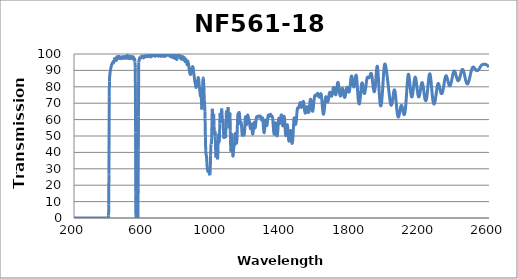
| Category | Transmission (%) |
|---|---|
| 2600.0 | 92.114 |
| 2599.0 | 92.203 |
| 2598.0 | 92.326 |
| 2597.0 | 92.426 |
| 2596.0 | 92.522 |
| 2595.0 | 92.617 |
| 2594.0 | 92.727 |
| 2593.0 | 92.835 |
| 2592.0 | 92.89 |
| 2591.0 | 92.995 |
| 2590.0 | 93.116 |
| 2589.0 | 93.186 |
| 2588.0 | 93.271 |
| 2587.0 | 93.36 |
| 2586.0 | 93.403 |
| 2585.0 | 93.418 |
| 2584.0 | 93.468 |
| 2583.0 | 93.502 |
| 2582.0 | 93.578 |
| 2581.0 | 93.599 |
| 2580.0 | 93.636 |
| 2579.0 | 93.667 |
| 2578.0 | 93.708 |
| 2577.0 | 93.737 |
| 2576.0 | 93.742 |
| 2575.0 | 93.785 |
| 2574.0 | 93.809 |
| 2573.0 | 93.809 |
| 2572.0 | 93.773 |
| 2571.0 | 93.778 |
| 2570.0 | 93.733 |
| 2569.0 | 93.734 |
| 2568.0 | 93.763 |
| 2567.0 | 93.677 |
| 2566.0 | 93.69 |
| 2565.0 | 93.678 |
| 2564.0 | 93.588 |
| 2563.0 | 93.552 |
| 2562.0 | 93.538 |
| 2561.0 | 93.467 |
| 2560.0 | 93.405 |
| 2559.0 | 93.328 |
| 2558.0 | 93.276 |
| 2557.0 | 93.203 |
| 2556.0 | 93.128 |
| 2555.0 | 92.994 |
| 2554.0 | 92.855 |
| 2553.0 | 92.7 |
| 2552.0 | 92.556 |
| 2551.0 | 92.392 |
| 2550.0 | 92.189 |
| 2549.0 | 92.025 |
| 2548.0 | 91.843 |
| 2547.0 | 91.636 |
| 2546.0 | 91.442 |
| 2545.0 | 91.264 |
| 2544.0 | 91.101 |
| 2543.0 | 90.962 |
| 2542.0 | 90.813 |
| 2541.0 | 90.681 |
| 2540.0 | 90.547 |
| 2539.0 | 90.412 |
| 2538.0 | 90.283 |
| 2537.0 | 90.152 |
| 2536.0 | 90.088 |
| 2535.0 | 89.992 |
| 2534.0 | 89.943 |
| 2533.0 | 89.9 |
| 2532.0 | 89.881 |
| 2531.0 | 89.858 |
| 2530.0 | 89.851 |
| 2529.0 | 89.848 |
| 2528.0 | 89.924 |
| 2527.0 | 89.988 |
| 2526.0 | 90.039 |
| 2525.0 | 90.13 |
| 2524.0 | 90.246 |
| 2523.0 | 90.4 |
| 2522.0 | 90.508 |
| 2521.0 | 90.605 |
| 2520.0 | 90.794 |
| 2519.0 | 90.948 |
| 2518.0 | 91.08 |
| 2517.0 | 91.257 |
| 2516.0 | 91.443 |
| 2515.0 | 91.589 |
| 2514.0 | 91.717 |
| 2513.0 | 91.81 |
| 2512.0 | 91.892 |
| 2511.0 | 91.968 |
| 2510.0 | 92.042 |
| 2509.0 | 92.045 |
| 2508.0 | 92.023 |
| 2507.0 | 91.958 |
| 2506.0 | 91.87 |
| 2505.0 | 91.759 |
| 2504.0 | 91.586 |
| 2503.0 | 91.426 |
| 2502.0 | 91.185 |
| 2501.0 | 90.9 |
| 2500.0 | 90.588 |
| 2499.0 | 90.236 |
| 2498.0 | 89.873 |
| 2497.0 | 89.489 |
| 2496.0 | 89.097 |
| 2495.0 | 88.667 |
| 2494.0 | 88.212 |
| 2493.0 | 87.712 |
| 2492.0 | 87.227 |
| 2491.0 | 86.74 |
| 2490.0 | 86.259 |
| 2489.0 | 85.813 |
| 2488.0 | 85.375 |
| 2487.0 | 84.913 |
| 2486.0 | 84.462 |
| 2485.0 | 84.022 |
| 2484.0 | 83.63 |
| 2483.0 | 83.297 |
| 2482.0 | 82.96 |
| 2481.0 | 82.649 |
| 2480.0 | 82.403 |
| 2479.0 | 82.187 |
| 2478.0 | 81.997 |
| 2477.0 | 81.872 |
| 2476.0 | 81.797 |
| 2475.0 | 81.761 |
| 2474.0 | 81.775 |
| 2473.0 | 81.842 |
| 2472.0 | 81.978 |
| 2471.0 | 82.159 |
| 2470.0 | 82.362 |
| 2469.0 | 82.623 |
| 2468.0 | 82.94 |
| 2467.0 | 83.262 |
| 2466.0 | 83.625 |
| 2465.0 | 84.072 |
| 2464.0 | 84.544 |
| 2463.0 | 85.013 |
| 2462.0 | 85.505 |
| 2461.0 | 85.97 |
| 2460.0 | 86.451 |
| 2459.0 | 86.948 |
| 2458.0 | 87.448 |
| 2457.0 | 87.901 |
| 2456.0 | 88.35 |
| 2455.0 | 88.74 |
| 2454.0 | 89.112 |
| 2453.0 | 89.479 |
| 2452.0 | 89.808 |
| 2451.0 | 90.079 |
| 2450.0 | 90.292 |
| 2449.0 | 90.456 |
| 2448.0 | 90.563 |
| 2447.0 | 90.604 |
| 2446.0 | 90.598 |
| 2445.0 | 90.521 |
| 2444.0 | 90.38 |
| 2443.0 | 90.214 |
| 2442.0 | 89.996 |
| 2441.0 | 89.702 |
| 2440.0 | 89.36 |
| 2439.0 | 88.974 |
| 2438.0 | 88.571 |
| 2437.0 | 88.156 |
| 2436.0 | 87.726 |
| 2435.0 | 87.284 |
| 2434.0 | 86.839 |
| 2433.0 | 86.407 |
| 2432.0 | 85.978 |
| 2431.0 | 85.581 |
| 2430.0 | 85.23 |
| 2429.0 | 84.921 |
| 2428.0 | 84.591 |
| 2427.0 | 84.298 |
| 2426.0 | 84.102 |
| 2425.0 | 83.939 |
| 2424.0 | 83.814 |
| 2423.0 | 83.741 |
| 2422.0 | 83.716 |
| 2421.0 | 83.725 |
| 2420.0 | 83.78 |
| 2419.0 | 83.899 |
| 2418.0 | 84.087 |
| 2417.0 | 84.31 |
| 2416.0 | 84.596 |
| 2415.0 | 84.92 |
| 2414.0 | 85.231 |
| 2413.0 | 85.578 |
| 2412.0 | 85.931 |
| 2411.0 | 86.288 |
| 2410.0 | 86.691 |
| 2409.0 | 87.113 |
| 2408.0 | 87.514 |
| 2407.0 | 87.905 |
| 2406.0 | 88.256 |
| 2405.0 | 88.558 |
| 2404.0 | 88.846 |
| 2403.0 | 89.115 |
| 2402.0 | 89.346 |
| 2401.0 | 89.502 |
| 2400.0 | 89.584 |
| 2399.0 | 89.629 |
| 2398.0 | 89.604 |
| 2397.0 | 89.496 |
| 2396.0 | 89.33 |
| 2395.0 | 89.074 |
| 2394.0 | 88.779 |
| 2393.0 | 88.453 |
| 2392.0 | 88.076 |
| 2391.0 | 87.604 |
| 2390.0 | 87.081 |
| 2389.0 | 86.55 |
| 2388.0 | 85.991 |
| 2387.0 | 85.445 |
| 2386.0 | 84.9 |
| 2385.0 | 84.362 |
| 2384.0 | 83.847 |
| 2383.0 | 83.309 |
| 2382.0 | 82.804 |
| 2381.0 | 82.363 |
| 2380.0 | 81.969 |
| 2379.0 | 81.614 |
| 2378.0 | 81.318 |
| 2377.0 | 81.067 |
| 2376.0 | 80.852 |
| 2375.0 | 80.692 |
| 2374.0 | 80.602 |
| 2373.0 | 80.591 |
| 2372.0 | 80.656 |
| 2371.0 | 80.78 |
| 2370.0 | 80.923 |
| 2369.0 | 81.111 |
| 2368.0 | 81.364 |
| 2367.0 | 81.653 |
| 2366.0 | 82.005 |
| 2365.0 | 82.397 |
| 2364.0 | 82.793 |
| 2363.0 | 83.24 |
| 2362.0 | 83.716 |
| 2361.0 | 84.165 |
| 2360.0 | 84.607 |
| 2359.0 | 85.027 |
| 2358.0 | 85.408 |
| 2357.0 | 85.787 |
| 2356.0 | 86.123 |
| 2355.0 | 86.419 |
| 2354.0 | 86.63 |
| 2353.0 | 86.754 |
| 2352.0 | 86.8 |
| 2351.0 | 86.745 |
| 2350.0 | 86.572 |
| 2349.0 | 86.339 |
| 2348.0 | 86.043 |
| 2347.0 | 85.715 |
| 2346.0 | 85.34 |
| 2345.0 | 84.838 |
| 2344.0 | 84.289 |
| 2343.0 | 83.681 |
| 2342.0 | 83.014 |
| 2341.0 | 82.342 |
| 2340.0 | 81.665 |
| 2339.0 | 81.003 |
| 2338.0 | 80.357 |
| 2337.0 | 79.719 |
| 2336.0 | 79.093 |
| 2335.0 | 78.511 |
| 2334.0 | 77.98 |
| 2333.0 | 77.496 |
| 2332.0 | 77.067 |
| 2331.0 | 76.692 |
| 2330.0 | 76.376 |
| 2329.0 | 76.123 |
| 2328.0 | 75.954 |
| 2327.0 | 75.87 |
| 2326.0 | 75.825 |
| 2325.0 | 75.848 |
| 2324.0 | 75.953 |
| 2323.0 | 76.137 |
| 2322.0 | 76.36 |
| 2321.0 | 76.633 |
| 2320.0 | 76.984 |
| 2319.0 | 77.402 |
| 2318.0 | 77.836 |
| 2317.0 | 78.335 |
| 2316.0 | 78.832 |
| 2315.0 | 79.321 |
| 2314.0 | 79.816 |
| 2313.0 | 80.295 |
| 2312.0 | 80.716 |
| 2311.0 | 81.096 |
| 2310.0 | 81.426 |
| 2309.0 | 81.725 |
| 2308.0 | 81.911 |
| 2307.0 | 82.015 |
| 2306.0 | 82.014 |
| 2305.0 | 81.872 |
| 2304.0 | 81.654 |
| 2303.0 | 81.322 |
| 2302.0 | 80.933 |
| 2301.0 | 80.404 |
| 2300.0 | 79.864 |
| 2299.0 | 79.216 |
| 2298.0 | 78.52 |
| 2297.0 | 77.739 |
| 2296.0 | 76.943 |
| 2295.0 | 76.161 |
| 2294.0 | 75.367 |
| 2293.0 | 74.579 |
| 2292.0 | 73.86 |
| 2291.0 | 73.127 |
| 2290.0 | 72.459 |
| 2289.0 | 71.822 |
| 2288.0 | 71.205 |
| 2287.0 | 70.674 |
| 2286.0 | 70.237 |
| 2285.0 | 69.912 |
| 2284.0 | 69.679 |
| 2283.0 | 69.542 |
| 2282.0 | 69.471 |
| 2281.0 | 69.516 |
| 2280.0 | 69.683 |
| 2279.0 | 69.974 |
| 2278.0 | 70.361 |
| 2277.0 | 70.873 |
| 2276.0 | 71.5 |
| 2275.0 | 72.21 |
| 2274.0 | 73.044 |
| 2273.0 | 74.012 |
| 2272.0 | 74.997 |
| 2271.0 | 76.1 |
| 2270.0 | 77.226 |
| 2269.0 | 78.386 |
| 2268.0 | 79.56 |
| 2267.0 | 80.751 |
| 2266.0 | 81.933 |
| 2265.0 | 83.088 |
| 2264.0 | 84.159 |
| 2263.0 | 85.154 |
| 2262.0 | 86.013 |
| 2261.0 | 86.715 |
| 2260.0 | 87.261 |
| 2259.0 | 87.683 |
| 2258.0 | 87.881 |
| 2257.0 | 87.915 |
| 2256.0 | 87.762 |
| 2255.0 | 87.412 |
| 2254.0 | 86.896 |
| 2253.0 | 86.266 |
| 2252.0 | 85.499 |
| 2251.0 | 84.605 |
| 2250.0 | 83.656 |
| 2249.0 | 82.619 |
| 2248.0 | 81.547 |
| 2247.0 | 80.44 |
| 2246.0 | 79.296 |
| 2245.0 | 78.209 |
| 2244.0 | 77.187 |
| 2243.0 | 76.194 |
| 2242.0 | 75.237 |
| 2241.0 | 74.398 |
| 2240.0 | 73.686 |
| 2239.0 | 73.004 |
| 2238.0 | 72.417 |
| 2237.0 | 71.992 |
| 2236.0 | 71.707 |
| 2235.0 | 71.549 |
| 2234.0 | 71.463 |
| 2233.0 | 71.571 |
| 2232.0 | 71.741 |
| 2231.0 | 72.056 |
| 2230.0 | 72.432 |
| 2229.0 | 72.905 |
| 2228.0 | 73.527 |
| 2227.0 | 74.196 |
| 2226.0 | 74.937 |
| 2225.0 | 75.733 |
| 2224.0 | 76.554 |
| 2223.0 | 77.41 |
| 2222.0 | 78.229 |
| 2221.0 | 79.041 |
| 2220.0 | 79.817 |
| 2219.0 | 80.507 |
| 2218.0 | 81.139 |
| 2217.0 | 81.705 |
| 2216.0 | 82.09 |
| 2215.0 | 82.362 |
| 2214.0 | 82.549 |
| 2213.0 | 82.603 |
| 2212.0 | 82.515 |
| 2211.0 | 82.335 |
| 2210.0 | 82.031 |
| 2209.0 | 81.583 |
| 2208.0 | 81.055 |
| 2207.0 | 80.527 |
| 2206.0 | 79.835 |
| 2205.0 | 79.146 |
| 2204.0 | 78.444 |
| 2203.0 | 77.75 |
| 2202.0 | 77.098 |
| 2201.0 | 76.398 |
| 2200.0 | 75.75 |
| 2199.0 | 75.159 |
| 2198.0 | 74.718 |
| 2197.0 | 74.377 |
| 2196.0 | 74.076 |
| 2195.0 | 73.891 |
| 2194.0 | 73.82 |
| 2193.0 | 73.89 |
| 2192.0 | 74.076 |
| 2191.0 | 74.38 |
| 2190.0 | 74.731 |
| 2189.0 | 75.224 |
| 2188.0 | 75.844 |
| 2187.0 | 76.585 |
| 2186.0 | 77.375 |
| 2185.0 | 78.232 |
| 2184.0 | 79.096 |
| 2183.0 | 80.01 |
| 2182.0 | 80.997 |
| 2181.0 | 81.867 |
| 2180.0 | 82.7 |
| 2179.0 | 83.503 |
| 2178.0 | 84.257 |
| 2177.0 | 84.85 |
| 2176.0 | 85.325 |
| 2175.0 | 85.646 |
| 2174.0 | 85.855 |
| 2173.0 | 85.897 |
| 2172.0 | 85.772 |
| 2171.0 | 85.475 |
| 2170.0 | 85.06 |
| 2169.0 | 84.484 |
| 2168.0 | 83.795 |
| 2167.0 | 83.003 |
| 2166.0 | 82.185 |
| 2165.0 | 81.238 |
| 2164.0 | 80.28 |
| 2163.0 | 79.319 |
| 2162.0 | 78.383 |
| 2161.0 | 77.481 |
| 2160.0 | 76.658 |
| 2159.0 | 75.871 |
| 2158.0 | 75.225 |
| 2157.0 | 74.662 |
| 2156.0 | 74.258 |
| 2155.0 | 73.988 |
| 2154.0 | 73.807 |
| 2153.0 | 73.806 |
| 2152.0 | 73.993 |
| 2151.0 | 74.313 |
| 2150.0 | 74.743 |
| 2149.0 | 75.312 |
| 2148.0 | 76.036 |
| 2147.0 | 76.903 |
| 2146.0 | 77.842 |
| 2145.0 | 78.872 |
| 2144.0 | 79.958 |
| 2143.0 | 81.106 |
| 2142.0 | 82.284 |
| 2141.0 | 83.367 |
| 2140.0 | 84.429 |
| 2139.0 | 85.375 |
| 2138.0 | 86.192 |
| 2137.0 | 86.901 |
| 2136.0 | 87.356 |
| 2135.0 | 87.608 |
| 2134.0 | 87.634 |
| 2133.0 | 87.436 |
| 2132.0 | 87.013 |
| 2131.0 | 86.331 |
| 2130.0 | 85.413 |
| 2129.0 | 84.308 |
| 2128.0 | 83.026 |
| 2127.0 | 81.662 |
| 2126.0 | 80.14 |
| 2125.0 | 78.51 |
| 2124.0 | 76.882 |
| 2123.0 | 75.316 |
| 2122.0 | 73.677 |
| 2121.0 | 72.13 |
| 2120.0 | 70.665 |
| 2119.0 | 69.301 |
| 2118.0 | 68.107 |
| 2117.0 | 66.964 |
| 2116.0 | 65.979 |
| 2115.0 | 65.133 |
| 2114.0 | 64.447 |
| 2113.0 | 63.881 |
| 2112.0 | 63.437 |
| 2111.0 | 63.155 |
| 2110.0 | 63.023 |
| 2109.0 | 63.027 |
| 2108.0 | 63.117 |
| 2107.0 | 63.33 |
| 2106.0 | 63.643 |
| 2105.0 | 64.061 |
| 2104.0 | 64.494 |
| 2103.0 | 64.99 |
| 2102.0 | 65.523 |
| 2101.0 | 66.069 |
| 2100.0 | 66.637 |
| 2099.0 | 67.144 |
| 2098.0 | 67.607 |
| 2097.0 | 68.006 |
| 2096.0 | 68.336 |
| 2095.0 | 68.573 |
| 2094.0 | 68.68 |
| 2093.0 | 68.672 |
| 2092.0 | 68.57 |
| 2091.0 | 68.364 |
| 2090.0 | 68.071 |
| 2089.0 | 67.706 |
| 2088.0 | 67.216 |
| 2087.0 | 66.686 |
| 2086.0 | 66.093 |
| 2085.0 | 65.486 |
| 2084.0 | 64.868 |
| 2083.0 | 64.233 |
| 2082.0 | 63.632 |
| 2081.0 | 63.105 |
| 2080.0 | 62.645 |
| 2079.0 | 62.249 |
| 2078.0 | 61.912 |
| 2077.0 | 61.674 |
| 2076.0 | 61.573 |
| 2075.0 | 61.605 |
| 2074.0 | 61.765 |
| 2073.0 | 62.036 |
| 2072.0 | 62.422 |
| 2071.0 | 62.942 |
| 2070.0 | 63.592 |
| 2069.0 | 64.36 |
| 2068.0 | 65.202 |
| 2067.0 | 66.142 |
| 2066.0 | 67.193 |
| 2065.0 | 68.342 |
| 2064.0 | 69.512 |
| 2063.0 | 70.673 |
| 2062.0 | 71.832 |
| 2061.0 | 72.968 |
| 2060.0 | 74.052 |
| 2059.0 | 75.099 |
| 2058.0 | 76.036 |
| 2057.0 | 76.777 |
| 2056.0 | 77.364 |
| 2055.0 | 77.788 |
| 2054.0 | 78.062 |
| 2053.0 | 78.15 |
| 2052.0 | 78.051 |
| 2051.0 | 77.783 |
| 2050.0 | 77.392 |
| 2049.0 | 76.883 |
| 2048.0 | 76.269 |
| 2047.0 | 75.544 |
| 2046.0 | 74.752 |
| 2045.0 | 73.93 |
| 2044.0 | 73.136 |
| 2043.0 | 72.363 |
| 2042.0 | 71.593 |
| 2041.0 | 70.912 |
| 2040.0 | 70.321 |
| 2039.0 | 69.795 |
| 2038.0 | 69.343 |
| 2037.0 | 69.016 |
| 2036.0 | 68.813 |
| 2035.0 | 68.721 |
| 2034.0 | 68.756 |
| 2033.0 | 68.882 |
| 2032.0 | 69.135 |
| 2031.0 | 69.519 |
| 2030.0 | 70.001 |
| 2029.0 | 70.566 |
| 2028.0 | 71.207 |
| 2027.0 | 71.941 |
| 2026.0 | 72.763 |
| 2025.0 | 73.627 |
| 2024.0 | 74.508 |
| 2023.0 | 75.424 |
| 2022.0 | 76.39 |
| 2021.0 | 77.367 |
| 2020.0 | 78.346 |
| 2019.0 | 79.294 |
| 2018.0 | 80.229 |
| 2017.0 | 81.18 |
| 2016.0 | 82.079 |
| 2015.0 | 82.958 |
| 2014.0 | 83.822 |
| 2013.0 | 84.667 |
| 2012.0 | 85.542 |
| 2011.0 | 86.372 |
| 2010.0 | 87.173 |
| 2009.0 | 87.979 |
| 2008.0 | 88.755 |
| 2007.0 | 89.537 |
| 2006.0 | 90.307 |
| 2005.0 | 91.033 |
| 2004.0 | 91.707 |
| 2003.0 | 92.313 |
| 2002.0 | 92.868 |
| 2001.0 | 93.336 |
| 2000.0 | 93.669 |
| 1999.0 | 93.879 |
| 1998.0 | 93.948 |
| 1997.0 | 93.819 |
| 1996.0 | 93.5 |
| 1995.0 | 92.955 |
| 1994.0 | 92.21 |
| 1993.0 | 91.282 |
| 1992.0 | 90.119 |
| 1991.0 | 88.781 |
| 1990.0 | 87.288 |
| 1989.0 | 85.698 |
| 1988.0 | 84.021 |
| 1987.0 | 82.291 |
| 1986.0 | 80.491 |
| 1985.0 | 78.798 |
| 1984.0 | 77.167 |
| 1983.0 | 75.58 |
| 1982.0 | 74.12 |
| 1981.0 | 72.798 |
| 1980.0 | 71.617 |
| 1979.0 | 70.606 |
| 1978.0 | 69.786 |
| 1977.0 | 69.136 |
| 1976.0 | 68.681 |
| 1975.0 | 68.413 |
| 1974.0 | 68.326 |
| 1973.0 | 68.438 |
| 1972.0 | 68.759 |
| 1971.0 | 69.276 |
| 1970.0 | 70.02 |
| 1969.0 | 70.972 |
| 1968.0 | 72.101 |
| 1967.0 | 73.411 |
| 1966.0 | 74.934 |
| 1965.0 | 76.539 |
| 1964.0 | 78.253 |
| 1963.0 | 80.189 |
| 1962.0 | 82.126 |
| 1961.0 | 83.988 |
| 1960.0 | 85.848 |
| 1959.0 | 87.609 |
| 1958.0 | 89.233 |
| 1957.0 | 90.589 |
| 1956.0 | 91.559 |
| 1955.0 | 92.261 |
| 1954.0 | 92.554 |
| 1953.0 | 92.518 |
| 1952.0 | 92.124 |
| 1951.0 | 91.437 |
| 1950.0 | 90.466 |
| 1949.0 | 89.225 |
| 1948.0 | 87.906 |
| 1947.0 | 86.515 |
| 1946.0 | 85.011 |
| 1945.0 | 83.576 |
| 1944.0 | 82.211 |
| 1943.0 | 80.979 |
| 1942.0 | 79.886 |
| 1941.0 | 78.949 |
| 1940.0 | 78.174 |
| 1939.0 | 77.585 |
| 1938.0 | 77.181 |
| 1937.0 | 76.973 |
| 1936.0 | 76.948 |
| 1935.0 | 77.127 |
| 1934.0 | 77.45 |
| 1933.0 | 77.943 |
| 1932.0 | 78.558 |
| 1931.0 | 79.307 |
| 1930.0 | 80.103 |
| 1929.0 | 81.023 |
| 1928.0 | 82.019 |
| 1927.0 | 82.998 |
| 1926.0 | 83.966 |
| 1925.0 | 84.859 |
| 1924.0 | 85.663 |
| 1923.0 | 86.411 |
| 1922.0 | 87.073 |
| 1921.0 | 87.595 |
| 1920.0 | 87.899 |
| 1919.0 | 88.081 |
| 1918.0 | 88.189 |
| 1917.0 | 88.176 |
| 1916.0 | 88.057 |
| 1915.0 | 87.784 |
| 1914.0 | 87.401 |
| 1913.0 | 86.995 |
| 1912.0 | 86.661 |
| 1911.0 | 86.349 |
| 1910.0 | 86.134 |
| 1909.0 | 85.925 |
| 1908.0 | 85.747 |
| 1907.0 | 85.613 |
| 1906.0 | 85.493 |
| 1905.0 | 85.513 |
| 1904.0 | 85.556 |
| 1903.0 | 85.68 |
| 1902.0 | 85.798 |
| 1901.0 | 85.88 |
| 1900.0 | 85.963 |
| 1899.0 | 85.903 |
| 1898.0 | 85.831 |
| 1897.0 | 85.835 |
| 1896.0 | 85.675 |
| 1895.0 | 85.323 |
| 1894.0 | 84.941 |
| 1893.0 | 84.425 |
| 1892.0 | 83.714 |
| 1891.0 | 82.938 |
| 1890.0 | 82.119 |
| 1889.0 | 81.248 |
| 1888.0 | 80.487 |
| 1887.0 | 79.694 |
| 1886.0 | 78.926 |
| 1885.0 | 78.159 |
| 1884.0 | 77.407 |
| 1883.0 | 76.837 |
| 1882.0 | 76.331 |
| 1881.0 | 76.04 |
| 1880.0 | 75.925 |
| 1879.0 | 75.915 |
| 1878.0 | 76.109 |
| 1877.0 | 76.319 |
| 1876.0 | 76.681 |
| 1875.0 | 77.219 |
| 1874.0 | 77.893 |
| 1873.0 | 78.614 |
| 1872.0 | 79.37 |
| 1871.0 | 80.133 |
| 1870.0 | 80.884 |
| 1869.0 | 81.518 |
| 1868.0 | 82.027 |
| 1867.0 | 82.244 |
| 1866.0 | 82.422 |
| 1865.0 | 82.332 |
| 1864.0 | 82.026 |
| 1863.0 | 81.557 |
| 1862.0 | 80.829 |
| 1861.0 | 79.768 |
| 1860.0 | 78.57 |
| 1859.0 | 77.327 |
| 1858.0 | 76.112 |
| 1857.0 | 74.97 |
| 1856.0 | 73.909 |
| 1855.0 | 72.831 |
| 1854.0 | 71.789 |
| 1853.0 | 70.908 |
| 1852.0 | 70.202 |
| 1851.0 | 69.802 |
| 1850.0 | 69.548 |
| 1849.0 | 69.559 |
| 1848.0 | 69.622 |
| 1847.0 | 69.915 |
| 1846.0 | 70.52 |
| 1845.0 | 71.021 |
| 1844.0 | 71.988 |
| 1843.0 | 73.13 |
| 1842.0 | 74.745 |
| 1841.0 | 76.25 |
| 1840.0 | 77.744 |
| 1839.0 | 79.308 |
| 1838.0 | 80.756 |
| 1837.0 | 82.458 |
| 1836.0 | 83.909 |
| 1835.0 | 85.172 |
| 1834.0 | 86.064 |
| 1833.0 | 86.671 |
| 1832.0 | 87.112 |
| 1831.0 | 87.102 |
| 1830.0 | 86.869 |
| 1829.0 | 86.422 |
| 1828.0 | 85.815 |
| 1827.0 | 84.972 |
| 1826.0 | 84.027 |
| 1825.0 | 83.234 |
| 1824.0 | 82.433 |
| 1823.0 | 81.792 |
| 1822.0 | 81.14 |
| 1821.0 | 80.575 |
| 1820.0 | 79.985 |
| 1819.0 | 79.873 |
| 1818.0 | 79.865 |
| 1817.0 | 80.071 |
| 1816.0 | 80.452 |
| 1815.0 | 80.982 |
| 1814.0 | 81.577 |
| 1813.0 | 82.277 |
| 1812.0 | 83.064 |
| 1811.0 | 83.874 |
| 1810.0 | 84.664 |
| 1809.0 | 85.379 |
| 1808.0 | 85.904 |
| 1807.0 | 86.306 |
| 1806.0 | 86.562 |
| 1805.0 | 86.591 |
| 1804.0 | 86.428 |
| 1803.0 | 86.056 |
| 1802.0 | 85.45 |
| 1801.0 | 84.627 |
| 1800.0 | 83.691 |
| 1799.0 | 82.722 |
| 1798.0 | 81.666 |
| 1797.0 | 80.726 |
| 1796.0 | 79.78 |
| 1795.0 | 78.902 |
| 1794.0 | 78.136 |
| 1793.0 | 77.526 |
| 1792.0 | 77.077 |
| 1791.0 | 76.83 |
| 1790.0 | 76.716 |
| 1789.0 | 76.771 |
| 1788.0 | 76.951 |
| 1787.0 | 77.254 |
| 1786.0 | 77.658 |
| 1785.0 | 78.084 |
| 1784.0 | 78.51 |
| 1783.0 | 78.925 |
| 1782.0 | 79.232 |
| 1781.0 | 79.561 |
| 1780.0 | 79.725 |
| 1779.0 | 79.708 |
| 1778.0 | 79.539 |
| 1777.0 | 79.253 |
| 1776.0 | 78.851 |
| 1775.0 | 78.327 |
| 1774.0 | 77.712 |
| 1773.0 | 77.054 |
| 1772.0 | 76.33 |
| 1771.0 | 75.7 |
| 1770.0 | 75.11 |
| 1769.0 | 74.546 |
| 1768.0 | 74.09 |
| 1767.0 | 73.759 |
| 1766.0 | 73.535 |
| 1765.0 | 73.498 |
| 1764.0 | 73.616 |
| 1763.0 | 73.883 |
| 1762.0 | 74.287 |
| 1761.0 | 74.79 |
| 1760.0 | 75.379 |
| 1759.0 | 76.043 |
| 1758.0 | 76.758 |
| 1757.0 | 77.395 |
| 1756.0 | 77.969 |
| 1755.0 | 78.468 |
| 1754.0 | 78.848 |
| 1753.0 | 79.043 |
| 1752.0 | 79.083 |
| 1751.0 | 78.937 |
| 1750.0 | 78.607 |
| 1749.0 | 78.149 |
| 1748.0 | 77.577 |
| 1747.0 | 76.976 |
| 1746.0 | 76.333 |
| 1745.0 | 75.745 |
| 1744.0 | 75.192 |
| 1743.0 | 74.765 |
| 1742.0 | 74.451 |
| 1741.0 | 74.345 |
| 1740.0 | 74.361 |
| 1739.0 | 74.542 |
| 1738.0 | 74.919 |
| 1737.0 | 75.448 |
| 1736.0 | 76.111 |
| 1735.0 | 76.893 |
| 1734.0 | 77.764 |
| 1733.0 | 78.679 |
| 1732.0 | 79.619 |
| 1731.0 | 80.522 |
| 1730.0 | 81.308 |
| 1729.0 | 81.968 |
| 1728.0 | 82.433 |
| 1727.0 | 82.672 |
| 1726.0 | 82.692 |
| 1725.0 | 82.496 |
| 1724.0 | 82.11 |
| 1723.0 | 81.488 |
| 1722.0 | 80.699 |
| 1721.0 | 79.829 |
| 1720.0 | 78.917 |
| 1719.0 | 78.025 |
| 1718.0 | 77.172 |
| 1717.0 | 76.444 |
| 1716.0 | 75.844 |
| 1715.0 | 75.416 |
| 1714.0 | 75.18 |
| 1713.0 | 75.143 |
| 1712.0 | 75.279 |
| 1711.0 | 75.566 |
| 1710.0 | 76 |
| 1709.0 | 76.554 |
| 1708.0 | 77.158 |
| 1707.0 | 77.795 |
| 1706.0 | 78.4 |
| 1705.0 | 78.927 |
| 1704.0 | 79.343 |
| 1703.0 | 79.603 |
| 1702.0 | 79.711 |
| 1701.0 | 79.618 |
| 1700.0 | 79.37 |
| 1699.0 | 78.971 |
| 1698.0 | 78.453 |
| 1697.0 | 77.831 |
| 1696.0 | 77.156 |
| 1695.0 | 76.477 |
| 1694.0 | 75.843 |
| 1693.0 | 75.284 |
| 1692.0 | 74.829 |
| 1691.0 | 74.507 |
| 1690.0 | 74.281 |
| 1689.0 | 74.213 |
| 1688.0 | 74.291 |
| 1687.0 | 74.476 |
| 1686.0 | 74.759 |
| 1685.0 | 75.116 |
| 1684.0 | 75.499 |
| 1683.0 | 75.891 |
| 1682.0 | 76.255 |
| 1681.0 | 76.514 |
| 1680.0 | 76.649 |
| 1679.0 | 76.655 |
| 1678.0 | 76.488 |
| 1677.0 | 76.14 |
| 1676.0 | 75.63 |
| 1675.0 | 75.005 |
| 1674.0 | 74.3 |
| 1673.0 | 73.559 |
| 1672.0 | 72.829 |
| 1671.0 | 72.164 |
| 1670.0 | 71.611 |
| 1669.0 | 71.167 |
| 1668.0 | 70.849 |
| 1667.0 | 70.751 |
| 1666.0 | 70.799 |
| 1665.0 | 71.007 |
| 1664.0 | 71.352 |
| 1663.0 | 71.782 |
| 1662.0 | 72.279 |
| 1661.0 | 72.805 |
| 1660.0 | 73.289 |
| 1659.0 | 73.656 |
| 1658.0 | 73.889 |
| 1657.0 | 73.937 |
| 1656.0 | 73.763 |
| 1655.0 | 73.363 |
| 1654.0 | 72.749 |
| 1653.0 | 71.926 |
| 1652.0 | 70.947 |
| 1651.0 | 69.854 |
| 1650.0 | 68.678 |
| 1649.0 | 67.491 |
| 1648.0 | 66.387 |
| 1647.0 | 65.393 |
| 1646.0 | 64.564 |
| 1645.0 | 63.939 |
| 1644.0 | 63.509 |
| 1643.0 | 63.296 |
| 1642.0 | 63.326 |
| 1641.0 | 63.628 |
| 1640.0 | 64.198 |
| 1639.0 | 65.003 |
| 1638.0 | 66.005 |
| 1637.0 | 67.147 |
| 1636.0 | 68.418 |
| 1635.0 | 69.775 |
| 1634.0 | 71.103 |
| 1633.0 | 72.371 |
| 1632.0 | 73.538 |
| 1631.0 | 74.481 |
| 1630.0 | 75.173 |
| 1629.0 | 75.62 |
| 1628.0 | 75.816 |
| 1627.0 | 75.798 |
| 1626.0 | 75.612 |
| 1625.0 | 75.302 |
| 1624.0 | 74.918 |
| 1623.0 | 74.542 |
| 1622.0 | 74.186 |
| 1621.0 | 73.892 |
| 1620.0 | 73.695 |
| 1619.0 | 73.621 |
| 1618.0 | 73.667 |
| 1617.0 | 73.817 |
| 1616.0 | 74.068 |
| 1615.0 | 74.39 |
| 1614.0 | 74.731 |
| 1613.0 | 75.078 |
| 1612.0 | 75.411 |
| 1611.0 | 75.673 |
| 1610.0 | 75.86 |
| 1609.0 | 75.982 |
| 1608.0 | 75.977 |
| 1607.0 | 75.88 |
| 1606.0 | 75.736 |
| 1605.0 | 75.523 |
| 1604.0 | 75.284 |
| 1603.0 | 75.045 |
| 1602.0 | 74.835 |
| 1601.0 | 74.685 |
| 1600.0 | 74.592 |
| 1599.0 | 74.56 |
| 1598.0 | 74.605 |
| 1597.0 | 74.693 |
| 1596.0 | 74.79 |
| 1595.0 | 74.84 |
| 1594.0 | 74.827 |
| 1593.0 | 74.683 |
| 1592.0 | 74.398 |
| 1591.0 | 73.944 |
| 1590.0 | 73.323 |
| 1589.0 | 72.512 |
| 1588.0 | 71.551 |
| 1587.0 | 70.472 |
| 1586.0 | 69.382 |
| 1585.0 | 68.288 |
| 1584.0 | 67.319 |
| 1583.0 | 66.477 |
| 1582.0 | 65.796 |
| 1581.0 | 65.307 |
| 1580.0 | 65.053 |
| 1579.0 | 65.04 |
| 1578.0 | 65.287 |
| 1577.0 | 65.753 |
| 1576.0 | 66.415 |
| 1575.0 | 67.268 |
| 1574.0 | 68.225 |
| 1573.0 | 69.228 |
| 1572.0 | 70.203 |
| 1571.0 | 71.121 |
| 1570.0 | 71.831 |
| 1569.0 | 72.272 |
| 1568.0 | 72.417 |
| 1567.0 | 72.266 |
| 1566.0 | 71.798 |
| 1565.0 | 71.081 |
| 1564.0 | 70.149 |
| 1563.0 | 69.097 |
| 1562.0 | 67.986 |
| 1561.0 | 66.911 |
| 1560.0 | 65.979 |
| 1559.0 | 65.183 |
| 1558.0 | 64.682 |
| 1557.0 | 64.396 |
| 1556.0 | 64.341 |
| 1555.0 | 64.503 |
| 1554.0 | 64.844 |
| 1553.0 | 65.356 |
| 1552.0 | 65.92 |
| 1551.0 | 66.577 |
| 1550.0 | 67.149 |
| 1549.0 | 67.564 |
| 1548.0 | 67.791 |
| 1547.0 | 67.818 |
| 1546.0 | 67.631 |
| 1545.0 | 67.267 |
| 1544.0 | 66.736 |
| 1543.0 | 66.117 |
| 1542.0 | 65.47 |
| 1541.0 | 64.86 |
| 1540.0 | 64.412 |
| 1539.0 | 64.088 |
| 1538.0 | 63.927 |
| 1537.0 | 63.975 |
| 1536.0 | 64.261 |
| 1535.0 | 64.785 |
| 1534.0 | 65.484 |
| 1533.0 | 66.336 |
| 1532.0 | 67.282 |
| 1531.0 | 68.224 |
| 1530.0 | 69.167 |
| 1529.0 | 70.017 |
| 1528.0 | 70.648 |
| 1527.0 | 71.031 |
| 1526.0 | 71.149 |
| 1525.0 | 71.033 |
| 1524.0 | 70.665 |
| 1523.0 | 70.135 |
| 1522.0 | 69.502 |
| 1521.0 | 68.873 |
| 1520.0 | 68.293 |
| 1519.0 | 67.874 |
| 1518.0 | 67.573 |
| 1517.0 | 67.447 |
| 1516.0 | 67.526 |
| 1515.0 | 67.794 |
| 1514.0 | 68.23 |
| 1513.0 | 68.758 |
| 1512.0 | 69.258 |
| 1511.0 | 69.727 |
| 1510.0 | 70.111 |
| 1509.0 | 70.319 |
| 1508.0 | 70.352 |
| 1507.0 | 70.165 |
| 1506.0 | 69.853 |
| 1505.0 | 69.388 |
| 1504.0 | 68.843 |
| 1503.0 | 68.316 |
| 1502.0 | 67.798 |
| 1501.0 | 67.416 |
| 1500.0 | 67.162 |
| 1499.0 | 67.08 |
| 1498.0 | 67.064 |
| 1497.0 | 67.112 |
| 1496.0 | 67.217 |
| 1495.0 | 67.268 |
| 1494.0 | 67.244 |
| 1493.0 | 67.06 |
| 1492.0 | 66.637 |
| 1491.0 | 66.024 |
| 1490.0 | 65.116 |
| 1489.0 | 64.029 |
| 1488.0 | 62.8 |
| 1487.0 | 61.492 |
| 1486.0 | 60.232 |
| 1485.0 | 59.077 |
| 1484.0 | 58.085 |
| 1483.0 | 57.471 |
| 1482.0 | 57.078 |
| 1481.0 | 57.014 |
| 1480.0 | 57.262 |
| 1479.0 | 57.768 |
| 1478.0 | 58.513 |
| 1477.0 | 59.362 |
| 1476.0 | 60.187 |
| 1475.0 | 60.794 |
| 1474.0 | 61.064 |
| 1473.0 | 60.858 |
| 1472.0 | 60.136 |
| 1471.0 | 58.733 |
| 1470.0 | 57.053 |
| 1469.0 | 55.12 |
| 1468.0 | 53.02 |
| 1467.0 | 51.075 |
| 1466.0 | 49.291 |
| 1465.0 | 47.777 |
| 1464.0 | 46.598 |
| 1463.0 | 45.889 |
| 1462.0 | 45.517 |
| 1461.0 | 45.573 |
| 1460.0 | 46.003 |
| 1459.0 | 46.783 |
| 1458.0 | 47.872 |
| 1457.0 | 49.105 |
| 1456.0 | 50.379 |
| 1455.0 | 51.622 |
| 1454.0 | 52.541 |
| 1453.0 | 53.178 |
| 1452.0 | 53.384 |
| 1451.0 | 53.157 |
| 1450.0 | 52.466 |
| 1449.0 | 51.489 |
| 1448.0 | 50.306 |
| 1447.0 | 49.215 |
| 1446.0 | 48.302 |
| 1445.0 | 47.4 |
| 1444.0 | 46.928 |
| 1443.0 | 46.843 |
| 1442.0 | 47.194 |
| 1441.0 | 47.961 |
| 1440.0 | 49.129 |
| 1439.0 | 50.557 |
| 1438.0 | 52.184 |
| 1437.0 | 53.794 |
| 1436.0 | 55.241 |
| 1435.0 | 56.304 |
| 1434.0 | 56.861 |
| 1433.0 | 56.851 |
| 1432.0 | 56.274 |
| 1431.0 | 55.26 |
| 1430.0 | 53.989 |
| 1429.0 | 52.741 |
| 1428.0 | 51.595 |
| 1427.0 | 50.728 |
| 1426.0 | 50.268 |
| 1425.0 | 50.286 |
| 1424.0 | 50.74 |
| 1423.0 | 51.627 |
| 1422.0 | 52.881 |
| 1421.0 | 54.479 |
| 1420.0 | 56.367 |
| 1419.0 | 58.24 |
| 1418.0 | 59.795 |
| 1417.0 | 60.944 |
| 1416.0 | 61.787 |
| 1415.0 | 62.047 |
| 1414.0 | 61.629 |
| 1413.0 | 60.676 |
| 1412.0 | 59.676 |
| 1411.0 | 58.576 |
| 1410.0 | 57.651 |
| 1409.0 | 56.826 |
| 1408.0 | 56.303 |
| 1407.0 | 56.209 |
| 1406.0 | 56.528 |
| 1405.0 | 57.272 |
| 1404.0 | 58.357 |
| 1403.0 | 59.543 |
| 1402.0 | 60.735 |
| 1401.0 | 61.882 |
| 1400.0 | 62.766 |
| 1399.0 | 62.865 |
| 1398.0 | 62.735 |
| 1397.0 | 62.339 |
| 1396.0 | 61.518 |
| 1395.0 | 60.271 |
| 1394.0 | 59.249 |
| 1393.0 | 58.442 |
| 1392.0 | 57.926 |
| 1391.0 | 57.806 |
| 1390.0 | 58.006 |
| 1389.0 | 58.584 |
| 1388.0 | 59.317 |
| 1387.0 | 59.979 |
| 1386.0 | 60.513 |
| 1385.0 | 60.832 |
| 1384.0 | 60.756 |
| 1383.0 | 60.038 |
| 1382.0 | 58.739 |
| 1381.0 | 56.977 |
| 1380.0 | 55.333 |
| 1379.0 | 53.802 |
| 1378.0 | 52.397 |
| 1377.0 | 51.24 |
| 1376.0 | 50.515 |
| 1375.0 | 50.121 |
| 1374.0 | 50.131 |
| 1373.0 | 50.599 |
| 1372.0 | 51.515 |
| 1371.0 | 52.739 |
| 1370.0 | 54.153 |
| 1369.0 | 55.497 |
| 1368.0 | 56.745 |
| 1367.0 | 57.687 |
| 1366.0 | 58.034 |
| 1365.0 | 57.857 |
| 1364.0 | 57.225 |
| 1363.0 | 56.238 |
| 1362.0 | 54.868 |
| 1361.0 | 53.363 |
| 1360.0 | 52.241 |
| 1359.0 | 51.437 |
| 1358.0 | 51.085 |
| 1357.0 | 51.198 |
| 1356.0 | 51.711 |
| 1355.0 | 52.572 |
| 1354.0 | 53.701 |
| 1353.0 | 55.067 |
| 1352.0 | 56.639 |
| 1351.0 | 58.198 |
| 1350.0 | 59.548 |
| 1349.0 | 60.609 |
| 1348.0 | 61.322 |
| 1347.0 | 61.749 |
| 1346.0 | 61.938 |
| 1345.0 | 61.988 |
| 1344.0 | 62.031 |
| 1343.0 | 62.089 |
| 1342.0 | 62.207 |
| 1341.0 | 62.391 |
| 1340.0 | 62.635 |
| 1339.0 | 62.892 |
| 1338.0 | 63.115 |
| 1337.0 | 63.239 |
| 1336.0 | 63.248 |
| 1335.0 | 63.138 |
| 1334.0 | 62.904 |
| 1333.0 | 62.579 |
| 1332.0 | 62.264 |
| 1331.0 | 62.014 |
| 1330.0 | 61.893 |
| 1329.0 | 61.908 |
| 1328.0 | 62.042 |
| 1327.0 | 62.272 |
| 1326.0 | 62.527 |
| 1325.0 | 62.728 |
| 1324.0 | 62.743 |
| 1323.0 | 62.523 |
| 1322.0 | 62.003 |
| 1321.0 | 61.201 |
| 1320.0 | 60.163 |
| 1319.0 | 59 |
| 1318.0 | 57.936 |
| 1317.0 | 57.097 |
| 1316.0 | 56.5 |
| 1315.0 | 56.272 |
| 1314.0 | 56.407 |
| 1313.0 | 56.898 |
| 1312.0 | 57.636 |
| 1311.0 | 58.489 |
| 1310.0 | 59.224 |
| 1309.0 | 59.696 |
| 1308.0 | 59.776 |
| 1307.0 | 59.379 |
| 1306.0 | 58.496 |
| 1305.0 | 57.236 |
| 1304.0 | 55.837 |
| 1303.0 | 54.477 |
| 1302.0 | 53.299 |
| 1301.0 | 52.46 |
| 1300.0 | 52.029 |
| 1299.0 | 52.046 |
| 1298.0 | 52.547 |
| 1297.0 | 53.476 |
| 1296.0 | 54.697 |
| 1295.0 | 56.111 |
| 1294.0 | 57.586 |
| 1293.0 | 58.975 |
| 1292.0 | 60.062 |
| 1291.0 | 60.784 |
| 1290.0 | 61.106 |
| 1289.0 | 61.072 |
| 1288.0 | 60.811 |
| 1287.0 | 60.454 |
| 1286.0 | 60.112 |
| 1285.0 | 59.888 |
| 1284.0 | 59.841 |
| 1283.0 | 59.996 |
| 1282.0 | 60.352 |
| 1281.0 | 60.833 |
| 1280.0 | 61.335 |
| 1279.0 | 61.764 |
| 1278.0 | 62.04 |
| 1277.0 | 62.173 |
| 1276.0 | 62.167 |
| 1275.0 | 62.052 |
| 1274.0 | 61.915 |
| 1273.0 | 61.819 |
| 1272.0 | 61.781 |
| 1271.0 | 61.83 |
| 1270.0 | 61.966 |
| 1269.0 | 62.112 |
| 1268.0 | 62.223 |
| 1267.0 | 62.271 |
| 1266.0 | 62.21 |
| 1265.0 | 62.048 |
| 1264.0 | 61.838 |
| 1263.0 | 61.636 |
| 1262.0 | 61.469 |
| 1261.0 | 61.413 |
| 1260.0 | 61.469 |
| 1259.0 | 61.589 |
| 1258.0 | 61.73 |
| 1257.0 | 61.782 |
| 1256.0 | 61.685 |
| 1255.0 | 61.335 |
| 1254.0 | 60.653 |
| 1253.0 | 59.72 |
| 1252.0 | 58.607 |
| 1251.0 | 57.422 |
| 1250.0 | 56.333 |
| 1249.0 | 55.491 |
| 1248.0 | 54.98 |
| 1247.0 | 54.86 |
| 1246.0 | 55.164 |
| 1245.0 | 55.802 |
| 1244.0 | 56.619 |
| 1243.0 | 57.451 |
| 1242.0 | 58.052 |
| 1241.0 | 58.21 |
| 1240.0 | 57.812 |
| 1239.0 | 56.879 |
| 1238.0 | 55.539 |
| 1237.0 | 54.068 |
| 1236.0 | 52.748 |
| 1235.0 | 51.758 |
| 1234.0 | 51.225 |
| 1233.0 | 51.218 |
| 1232.0 | 51.753 |
| 1231.0 | 52.722 |
| 1230.0 | 53.972 |
| 1229.0 | 55.271 |
| 1228.0 | 56.373 |
| 1227.0 | 57.063 |
| 1226.0 | 57.243 |
| 1225.0 | 56.947 |
| 1224.0 | 56.313 |
| 1223.0 | 55.564 |
| 1222.0 | 54.932 |
| 1221.0 | 54.563 |
| 1220.0 | 54.523 |
| 1219.0 | 54.869 |
| 1218.0 | 55.536 |
| 1217.0 | 56.418 |
| 1216.0 | 57.393 |
| 1215.0 | 58.319 |
| 1214.0 | 59.107 |
| 1213.0 | 59.692 |
| 1212.0 | 60.102 |
| 1211.0 | 60.425 |
| 1210.0 | 60.723 |
| 1209.0 | 61.079 |
| 1208.0 | 61.557 |
| 1207.0 | 62.077 |
| 1206.0 | 62.549 |
| 1205.0 | 62.808 |
| 1204.0 | 62.631 |
| 1203.0 | 61.987 |
| 1202.0 | 60.958 |
| 1201.0 | 59.7 |
| 1200.0 | 58.441 |
| 1199.0 | 57.45 |
| 1198.0 | 56.901 |
| 1197.0 | 56.942 |
| 1196.0 | 57.606 |
| 1195.0 | 58.726 |
| 1194.0 | 60.066 |
| 1193.0 | 61.223 |
| 1192.0 | 61.794 |
| 1191.0 | 61.477 |
| 1190.0 | 60.268 |
| 1189.0 | 58.295 |
| 1188.0 | 56.087 |
| 1187.0 | 53.995 |
| 1186.0 | 52.265 |
| 1185.0 | 51.123 |
| 1184.0 | 50.608 |
| 1183.0 | 50.63 |
| 1182.0 | 51.033 |
| 1181.0 | 51.583 |
| 1180.0 | 52.038 |
| 1179.0 | 52.229 |
| 1178.0 | 52.068 |
| 1177.0 | 51.604 |
| 1176.0 | 51.042 |
| 1175.0 | 50.556 |
| 1174.0 | 50.385 |
| 1173.0 | 50.667 |
| 1172.0 | 51.441 |
| 1171.0 | 52.691 |
| 1170.0 | 54.256 |
| 1169.0 | 55.821 |
| 1168.0 | 57.218 |
| 1167.0 | 58.115 |
| 1166.0 | 58.435 |
| 1165.0 | 58.254 |
| 1164.0 | 57.825 |
| 1163.0 | 57.492 |
| 1162.0 | 57.498 |
| 1161.0 | 58.055 |
| 1160.0 | 59.163 |
| 1159.0 | 60.619 |
| 1158.0 | 62.168 |
| 1157.0 | 63.448 |
| 1156.0 | 64.215 |
| 1155.0 | 64.39 |
| 1154.0 | 64.074 |
| 1153.0 | 63.565 |
| 1152.0 | 63.219 |
| 1151.0 | 63.198 |
| 1150.0 | 63.455 |
| 1149.0 | 63.663 |
| 1148.0 | 63.366 |
| 1147.0 | 62.106 |
| 1146.0 | 59.927 |
| 1145.0 | 56.854 |
| 1144.0 | 53.444 |
| 1143.0 | 50.256 |
| 1142.0 | 47.727 |
| 1141.0 | 46.111 |
| 1140.0 | 45.535 |
| 1139.0 | 45.939 |
| 1138.0 | 47.111 |
| 1137.0 | 48.768 |
| 1136.0 | 50.436 |
| 1135.0 | 51.53 |
| 1134.0 | 51.584 |
| 1133.0 | 50.731 |
| 1132.0 | 49.188 |
| 1131.0 | 47.441 |
| 1130.0 | 45.945 |
| 1129.0 | 44.873 |
| 1128.0 | 44.339 |
| 1127.0 | 44.218 |
| 1126.0 | 44.237 |
| 1125.0 | 44.03 |
| 1124.0 | 43.293 |
| 1123.0 | 41.936 |
| 1122.0 | 40.343 |
| 1121.0 | 38.859 |
| 1120.0 | 37.864 |
| 1119.0 | 37.759 |
| 1118.0 | 38.757 |
| 1117.0 | 41.005 |
| 1116.0 | 44.287 |
| 1115.0 | 47.805 |
| 1114.0 | 50.62 |
| 1113.0 | 51.568 |
| 1112.0 | 50.305 |
| 1111.0 | 47.388 |
| 1110.0 | 44.181 |
| 1109.0 | 41.685 |
| 1108.0 | 40.514 |
| 1107.0 | 41.097 |
| 1106.0 | 43.573 |
| 1105.0 | 47.859 |
| 1104.0 | 53.564 |
| 1103.0 | 59.09 |
| 1102.0 | 63.152 |
| 1101.0 | 64.29 |
| 1100.0 | 62.6 |
| 1099.0 | 59.469 |
| 1098.0 | 56.476 |
| 1097.0 | 54.724 |
| 1096.0 | 54.83 |
| 1095.0 | 56.772 |
| 1094.0 | 60.046 |
| 1093.0 | 63.711 |
| 1092.0 | 66.676 |
| 1091.0 | 67.544 |
| 1090.0 | 66.084 |
| 1089.0 | 63.067 |
| 1088.0 | 60.108 |
| 1087.0 | 58.212 |
| 1086.0 | 57.924 |
| 1085.0 | 59.331 |
| 1084.0 | 61.911 |
| 1083.0 | 64.434 |
| 1082.0 | 65.474 |
| 1081.0 | 64.104 |
| 1080.0 | 60.578 |
| 1079.0 | 56.142 |
| 1078.0 | 52.275 |
| 1077.0 | 49.748 |
| 1076.0 | 48.901 |
| 1075.0 | 49.539 |
| 1074.0 | 51.202 |
| 1073.0 | 52.748 |
| 1072.0 | 53.608 |
| 1071.0 | 53.194 |
| 1070.0 | 51.713 |
| 1069.0 | 49.955 |
| 1068.0 | 48.649 |
| 1067.0 | 48.396 |
| 1066.0 | 49.47 |
| 1065.0 | 51.717 |
| 1064.0 | 54.423 |
| 1063.0 | 57.116 |
| 1062.0 | 58.922 |
| 1061.0 | 59.639 |
| 1060.0 | 59.634 |
| 1059.0 | 59.588 |
| 1058.0 | 60.154 |
| 1057.0 | 61.602 |
| 1056.0 | 63.745 |
| 1055.0 | 65.762 |
| 1054.0 | 66.748 |
| 1053.0 | 66.111 |
| 1052.0 | 63.976 |
| 1051.0 | 61.088 |
| 1050.0 | 58.79 |
| 1049.0 | 58.074 |
| 1048.0 | 58.943 |
| 1047.0 | 61.016 |
| 1046.0 | 63.172 |
| 1045.0 | 63.793 |
| 1044.0 | 61.78 |
| 1043.0 | 57.565 |
| 1042.0 | 52.551 |
| 1041.0 | 48.483 |
| 1040.0 | 46.173 |
| 1039.0 | 46.03 |
| 1038.0 | 47.643 |
| 1037.0 | 50.006 |
| 1036.0 | 51.255 |
| 1035.0 | 50.339 |
| 1034.0 | 47.017 |
| 1033.0 | 42.486 |
| 1032.0 | 38.677 |
| 1031.0 | 36.242 |
| 1030.0 | 35.769 |
| 1029.0 | 37.141 |
| 1028.0 | 39.894 |
| 1027.0 | 42.858 |
| 1026.0 | 44.758 |
| 1025.0 | 44.353 |
| 1024.0 | 42.221 |
| 1023.0 | 39.486 |
| 1022.0 | 37.379 |
| 1021.0 | 36.846 |
| 1020.0 | 38.242 |
| 1019.0 | 41.354 |
| 1018.0 | 45.626 |
| 1017.0 | 49.744 |
| 1016.0 | 52.482 |
| 1015.0 | 52.948 |
| 1014.0 | 51.997 |
| 1013.0 | 50.869 |
| 1012.0 | 50.92 |
| 1011.0 | 52.816 |
| 1010.0 | 56.224 |
| 1009.0 | 60.168 |
| 1008.0 | 63.03 |
| 1007.0 | 63.407 |
| 1006.0 | 61.641 |
| 1005.0 | 59.137 |
| 1004.0 | 57.737 |
| 1003.0 | 58.54 |
| 1002.0 | 61.536 |
| 1001.0 | 65.128 |
| 1000.0 | 66.578 |
| 999.0 | 64.526 |
| 998.0 | 59.34 |
| 997.0 | 52.967 |
| 996.0 | 48.254 |
| 995.0 | 45.634 |
| 994.0 | 44.888 |
| 993.0 | 45.019 |
| 992.0 | 44.491 |
| 991.0 | 42.127 |
| 990.0 | 38.293 |
| 989.0 | 33.823 |
| 988.0 | 29.809 |
| 987.0 | 27.165 |
| 986.0 | 26.112 |
| 985.0 | 26.239 |
| 984.0 | 27.183 |
| 983.0 | 28.463 |
| 982.0 | 29.452 |
| 981.0 | 29.889 |
| 980.0 | 29.669 |
| 979.0 | 29.119 |
| 978.0 | 28.578 |
| 977.0 | 28.23 |
| 976.0 | 28.138 |
| 975.0 | 28.285 |
| 974.0 | 28.519 |
| 973.0 | 28.81 |
| 972.0 | 29.272 |
| 971.0 | 30.082 |
| 970.0 | 31.358 |
| 969.0 | 33.098 |
| 968.0 | 34.998 |
| 967.0 | 36.736 |
| 966.0 | 37.816 |
| 965.0 | 38.332 |
| 964.0 | 38.557 |
| 963.0 | 39.182 |
| 962.0 | 40.997 |
| 961.0 | 44.511 |
| 960.0 | 49.485 |
| 959.0 | 55.121 |
| 958.0 | 60.731 |
| 957.0 | 65.09 |
| 956.0 | 67.69 |
| 955.0 | 69.513 |
| 954.0 | 71.276 |
| 953.0 | 73.71 |
| 952.0 | 76.783 |
| 951.0 | 79.682 |
| 950.0 | 81.979 |
| 949.0 | 83.639 |
| 948.0 | 84.76 |
| 947.0 | 85.327 |
| 946.0 | 85.13 |
| 945.0 | 83.589 |
| 944.0 | 80.315 |
| 943.0 | 75.941 |
| 942.0 | 71.504 |
| 941.0 | 67.936 |
| 940.0 | 66.184 |
| 939.0 | 66.567 |
| 938.0 | 68.603 |
| 937.0 | 71.398 |
| 936.0 | 73.826 |
| 935.0 | 75.118 |
| 934.0 | 75.368 |
| 933.0 | 74.89 |
| 932.0 | 74.398 |
| 931.0 | 74.4 |
| 930.0 | 74.985 |
| 929.0 | 75.968 |
| 928.0 | 77.003 |
| 927.0 | 77.951 |
| 926.0 | 78.881 |
| 925.0 | 79.907 |
| 924.0 | 81.057 |
| 923.0 | 82.266 |
| 922.0 | 83.431 |
| 921.0 | 84.428 |
| 920.0 | 85.144 |
| 919.0 | 85.574 |
| 918.0 | 85.599 |
| 917.0 | 85.107 |
| 916.0 | 84.148 |
| 915.0 | 82.877 |
| 914.0 | 81.743 |
| 913.0 | 81.098 |
| 912.0 | 81.042 |
| 911.0 | 81.371 |
| 910.0 | 81.589 |
| 909.0 | 81.421 |
| 908.0 | 80.821 |
| 907.0 | 80.056 |
| 906.0 | 79.612 |
| 905.0 | 79.714 |
| 904.0 | 80.259 |
| 903.0 | 81.036 |
| 902.0 | 81.705 |
| 901.0 | 82.2 |
| 900.0 | 82.595 |
| 899.0 | 83.046 |
| 898.0 | 83.755 |
| 897.0 | 84.7 |
| 896.0 | 85.666 |
| 895.0 | 86.581 |
| 894.0 | 87.402 |
| 893.0 | 88.173 |
| 892.0 | 88.955 |
| 891.0 | 89.822 |
| 890.0 | 90.691 |
| 889.0 | 91.426 |
| 888.0 | 91.969 |
| 887.0 | 92.277 |
| 886.0 | 92.325 |
| 885.0 | 92.113 |
| 884.0 | 91.731 |
| 883.0 | 91.24 |
| 882.0 | 90.711 |
| 881.0 | 90.226 |
| 880.0 | 89.804 |
| 879.0 | 89.362 |
| 878.0 | 88.875 |
| 877.0 | 88.375 |
| 876.0 | 87.911 |
| 875.0 | 87.601 |
| 874.0 | 87.485 |
| 873.0 | 87.518 |
| 872.0 | 87.685 |
| 871.0 | 87.933 |
| 870.0 | 88.199 |
| 869.0 | 88.608 |
| 868.0 | 89.172 |
| 867.0 | 89.896 |
| 866.0 | 90.774 |
| 865.0 | 91.695 |
| 864.0 | 92.603 |
| 863.0 | 93.419 |
| 862.0 | 94.077 |
| 861.0 | 94.544 |
| 860.0 | 94.793 |
| 859.0 | 95.267 |
| 858.0 | 95.776 |
| 857.0 | 95.563 |
| 856.0 | 94.581 |
| 855.0 | 93.625 |
| 854.0 | 93.452 |
| 853.0 | 94.132 |
| 852.0 | 95.177 |
| 851.0 | 95.751 |
| 850.0 | 95.734 |
| 849.0 | 95.746 |
| 848.0 | 96.181 |
| 847.0 | 96.701 |
| 846.0 | 96.851 |
| 845.0 | 96.336 |
| 844.0 | 95.493 |
| 843.0 | 95.332 |
| 842.0 | 96.08 |
| 841.0 | 97.095 |
| 840.0 | 97.591 |
| 839.0 | 97.147 |
| 838.0 | 96.298 |
| 837.0 | 96.116 |
| 836.0 | 96.883 |
| 835.0 | 97.788 |
| 834.0 | 98.029 |
| 833.0 | 97.449 |
| 832.0 | 96.696 |
| 831.0 | 96.677 |
| 830.0 | 97.503 |
| 829.0 | 98.333 |
| 828.0 | 98.376 |
| 827.0 | 97.719 |
| 826.0 | 97.266 |
| 825.0 | 97.615 |
| 824.0 | 98.349 |
| 823.0 | 98.533 |
| 822.0 | 97.915 |
| 821.0 | 97.097 |
| 820.0 | 96.897 |
| 819.0 | 97.622 |
| 818.0 | 98.541 |
| 817.0 | 98.651 |
| 816.0 | 98.034 |
| 815.0 | 97.526 |
| 814.0 | 97.674 |
| 813.0 | 98.397 |
| 812.0 | 98.953 |
| 811.0 | 98.905 |
| 810.0 | 98.628 |
| 809.0 | 98.641 |
| 808.0 | 98.964 |
| 807.0 | 99.232 |
| 806.0 | 99.118 |
| 805.0 | 98.836 |
| 804.0 | 98.872 |
| 803.0 | 99.159 |
| 802.0 | 99.202 |
| 801.0 | 98.814 |
| 800.0 | 98.368 |
| 799.0 | 98.468 |
| 798.0 | 98.961 |
| 797.0 | 98.976 |
| 796.0 | 97.992 |
| 795.0 | 96.859 |
| 794.0 | 96.642 |
| 793.0 | 97.544 |
| 792.0 | 98.659 |
| 791.0 | 98.707 |
| 790.0 | 97.651 |
| 789.0 | 96.82 |
| 788.0 | 97.233 |
| 787.0 | 98.378 |
| 786.0 | 98.892 |
| 785.0 | 98.229 |
| 784.0 | 97.372 |
| 783.0 | 97.504 |
| 782.0 | 98.422 |
| 781.0 | 99.065 |
| 780.0 | 98.908 |
| 779.0 | 98.437 |
| 778.0 | 98.432 |
| 777.0 | 98.964 |
| 776.0 | 99.081 |
| 775.0 | 98.462 |
| 774.0 | 97.895 |
| 773.0 | 97.994 |
| 772.0 | 98.517 |
| 771.0 | 98.824 |
| 770.0 | 98.471 |
| 769.0 | 98.041 |
| 768.0 | 98.288 |
| 767.0 | 98.819 |
| 766.0 | 98.866 |
| 765.0 | 98.419 |
| 764.0 | 98.132 |
| 763.0 | 98.454 |
| 762.0 | 99.03 |
| 761.0 | 99.122 |
| 760.0 | 98.625 |
| 759.0 | 98.384 |
| 758.0 | 98.704 |
| 757.0 | 99.12 |
| 756.0 | 99.165 |
| 755.0 | 98.795 |
| 754.0 | 98.525 |
| 753.0 | 98.799 |
| 752.0 | 99.233 |
| 751.0 | 99.399 |
| 750.0 | 99.375 |
| 749.0 | 99.312 |
| 748.0 | 99.311 |
| 747.0 | 99.444 |
| 746.0 | 99.475 |
| 745.0 | 99.391 |
| 744.0 | 99.399 |
| 743.0 | 99.443 |
| 742.0 | 99.445 |
| 741.0 | 99.475 |
| 740.0 | 99.366 |
| 739.0 | 99.497 |
| 738.0 | 99.499 |
| 737.0 | 99.277 |
| 736.0 | 99.556 |
| 735.0 | 99.565 |
| 734.0 | 99.856 |
| 733.0 | 98.569 |
| 732.0 | 99.075 |
| 731.0 | 99.29 |
| 730.0 | 98.718 |
| 729.0 | 99.819 |
| 728.0 | 99.495 |
| 727.0 | 99.992 |
| 726.0 | 97.896 |
| 725.0 | 98.487 |
| 724.0 | 98.573 |
| 723.0 | 98.664 |
| 722.0 | 98.686 |
| 721.0 | 98.961 |
| 720.0 | 98.764 |
| 719.0 | 99.484 |
| 718.0 | 98.7 |
| 717.0 | 99.363 |
| 716.0 | 99.519 |
| 715.0 | 99.087 |
| 714.0 | 98.287 |
| 713.0 | 98.71 |
| 712.0 | 98.789 |
| 711.0 | 98.405 |
| 710.0 | 99.728 |
| 709.0 | 99.1 |
| 708.0 | 98.806 |
| 707.0 | 99.438 |
| 706.0 | 98.957 |
| 705.0 | 98.595 |
| 704.0 | 99.235 |
| 703.0 | 99.874 |
| 702.0 | 98.509 |
| 701.0 | 98.368 |
| 700.0 | 99.688 |
| 699.0 | 99.837 |
| 698.0 | 99.272 |
| 697.0 | 98.805 |
| 696.0 | 99.419 |
| 695.0 | 98.973 |
| 694.0 | 98.893 |
| 693.0 | 98.744 |
| 692.0 | 99.132 |
| 691.0 | 98.849 |
| 690.0 | 99.093 |
| 689.0 | 98.868 |
| 688.0 | 98.677 |
| 687.0 | 99.23 |
| 686.0 | 99.198 |
| 685.0 | 99.04 |
| 684.0 | 99.016 |
| 683.0 | 99.236 |
| 682.0 | 99.174 |
| 681.0 | 99.43 |
| 680.0 | 99.704 |
| 679.0 | 99.143 |
| 678.0 | 99.116 |
| 677.0 | 99.042 |
| 676.0 | 99.348 |
| 675.0 | 99.225 |
| 674.0 | 98.945 |
| 673.0 | 98.83 |
| 672.0 | 99.263 |
| 671.0 | 99.543 |
| 670.0 | 99.166 |
| 669.0 | 98.673 |
| 668.0 | 98.641 |
| 667.0 | 99.589 |
| 666.0 | 99.726 |
| 665.0 | 99.467 |
| 664.0 | 99.574 |
| 663.0 | 99.792 |
| 662.0 | 99.411 |
| 661.0 | 99.326 |
| 660.0 | 99.309 |
| 659.0 | 99.073 |
| 658.0 | 99.287 |
| 657.0 | 99.989 |
| 656.0 | 99.623 |
| 655.0 | 98.702 |
| 654.0 | 99.326 |
| 653.0 | 99.411 |
| 652.0 | 98.822 |
| 651.0 | 98.611 |
| 650.0 | 98.757 |
| 649.0 | 99.066 |
| 648.0 | 99.468 |
| 647.0 | 99.705 |
| 646.0 | 99.657 |
| 645.0 | 99.419 |
| 644.0 | 98.615 |
| 643.0 | 98.221 |
| 642.0 | 98.369 |
| 641.0 | 98.509 |
| 640.0 | 98.738 |
| 639.0 | 99.325 |
| 638.0 | 98.98 |
| 637.0 | 99.133 |
| 636.0 | 98.617 |
| 635.0 | 98.818 |
| 634.0 | 99.081 |
| 633.0 | 99.045 |
| 632.0 | 98.836 |
| 631.0 | 98.906 |
| 630.0 | 98.482 |
| 629.0 | 98.662 |
| 628.0 | 98.831 |
| 627.0 | 98.352 |
| 626.0 | 98.349 |
| 625.0 | 98.54 |
| 624.0 | 98.369 |
| 623.0 | 98.615 |
| 622.0 | 99.083 |
| 621.0 | 98.985 |
| 620.0 | 98.599 |
| 619.0 | 98.688 |
| 618.0 | 98.629 |
| 617.0 | 98.841 |
| 616.0 | 98.368 |
| 615.0 | 98.454 |
| 614.0 | 98.769 |
| 613.0 | 98.908 |
| 612.0 | 98.791 |
| 611.0 | 98.842 |
| 610.0 | 98.228 |
| 609.0 | 98.64 |
| 608.0 | 98.771 |
| 607.0 | 98.456 |
| 606.0 | 98.505 |
| 605.0 | 98.595 |
| 604.0 | 98.258 |
| 603.0 | 97.988 |
| 602.0 | 97.575 |
| 601.0 | 98.13 |
| 600.0 | 98.536 |
| 599.0 | 98.255 |
| 598.0 | 98.234 |
| 597.0 | 98.51 |
| 596.0 | 98.034 |
| 595.0 | 98.85 |
| 594.0 | 98.668 |
| 593.0 | 98.395 |
| 592.0 | 98.422 |
| 591.0 | 98.815 |
| 590.0 | 98.457 |
| 589.0 | 97.941 |
| 588.0 | 97.953 |
| 587.0 | 98.025 |
| 586.0 | 97.567 |
| 585.0 | 98.124 |
| 584.0 | 97.853 |
| 583.0 | 98.04 |
| 582.0 | 96.95 |
| 581.0 | 96.836 |
| 580.0 | 97.659 |
| 579.0 | 97.344 |
| 578.0 | 96.847 |
| 577.0 | 96.733 |
| 576.0 | 96.459 |
| 575.0 | 95.386 |
| 574.0 | 94.819 |
| 573.0 | 61.691 |
| 572.0 | 40.963 |
| 571.0 | 17.061 |
| 570.0 | 0.012 |
| 569.0 | 0.001 |
| 568.0 | 0 |
| 567.0 | 0 |
| 566.0 | 0 |
| 565.0 | 0 |
| 564.0 | 0 |
| 563.0 | 0 |
| 562.0 | 0 |
| 561.0 | 0 |
| 560.0 | 0 |
| 559.0 | 0.005 |
| 558.0 | 0.073 |
| 557.0 | 15.105 |
| 556.0 | 52.188 |
| 555.0 | 82.317 |
| 554.0 | 91.943 |
| 553.0 | 94.95 |
| 552.0 | 95.443 |
| 551.0 | 96.385 |
| 550.0 | 97.682 |
| 549.0 | 97.157 |
| 548.0 | 96.948 |
| 547.0 | 96.421 |
| 546.0 | 96.646 |
| 545.0 | 97.68 |
| 544.0 | 98.251 |
| 543.0 | 97.826 |
| 542.0 | 97.48 |
| 541.0 | 97.219 |
| 540.0 | 97.424 |
| 539.0 | 97.984 |
| 538.0 | 98.368 |
| 537.0 | 98.238 |
| 536.0 | 97.978 |
| 535.0 | 97.781 |
| 534.0 | 97.649 |
| 533.0 | 97.933 |
| 532.0 | 98.356 |
| 531.0 | 98.336 |
| 530.0 | 97.815 |
| 529.0 | 97.179 |
| 528.0 | 97.664 |
| 527.0 | 98.315 |
| 526.0 | 98.79 |
| 525.0 | 98.315 |
| 524.0 | 97.74 |
| 523.0 | 97.186 |
| 522.0 | 97.528 |
| 521.0 | 98.43 |
| 520.0 | 98.773 |
| 519.0 | 97.886 |
| 518.0 | 97.472 |
| 517.0 | 97.422 |
| 516.0 | 97.89 |
| 515.0 | 97.955 |
| 514.0 | 98.381 |
| 513.0 | 98.206 |
| 512.0 | 97.712 |
| 511.0 | 97.31 |
| 510.0 | 98.019 |
| 509.0 | 98.936 |
| 508.0 | 99.283 |
| 507.0 | 98.768 |
| 506.0 | 98.16 |
| 505.0 | 97.687 |
| 504.0 | 97.911 |
| 503.0 | 98.772 |
| 502.0 | 99.24 |
| 501.0 | 98.266 |
| 500.0 | 97.995 |
| 499.0 | 97.513 |
| 498.0 | 97.911 |
| 497.0 | 99.021 |
| 496.0 | 98.306 |
| 495.0 | 97.664 |
| 494.0 | 97.485 |
| 493.0 | 96.7 |
| 492.0 | 97.414 |
| 491.0 | 98.133 |
| 490.0 | 98.369 |
| 489.0 | 97.513 |
| 488.0 | 97.384 |
| 487.0 | 97.447 |
| 486.0 | 97.238 |
| 485.0 | 98.406 |
| 484.0 | 98.763 |
| 483.0 | 97.796 |
| 482.0 | 97.606 |
| 481.0 | 97.464 |
| 480.0 | 97.794 |
| 479.0 | 98.539 |
| 478.0 | 99.006 |
| 477.0 | 97.737 |
| 476.0 | 97.412 |
| 475.0 | 97.599 |
| 474.0 | 97.205 |
| 473.0 | 97.908 |
| 472.0 | 98.235 |
| 471.0 | 96.81 |
| 470.0 | 97.162 |
| 469.0 | 97.158 |
| 468.0 | 97.315 |
| 467.0 | 97.852 |
| 466.0 | 98.67 |
| 465.0 | 97.802 |
| 464.0 | 97.047 |
| 463.0 | 96.8 |
| 462.0 | 98.059 |
| 461.0 | 98.398 |
| 460.0 | 98.589 |
| 459.0 | 98.155 |
| 458.0 | 97.899 |
| 457.0 | 97.344 |
| 456.0 | 97.438 |
| 455.0 | 97.37 |
| 454.0 | 97.607 |
| 453.0 | 97.716 |
| 452.0 | 97.184 |
| 451.0 | 96.644 |
| 450.0 | 97.464 |
| 449.0 | 98.304 |
| 448.0 | 98.122 |
| 447.0 | 97.103 |
| 446.0 | 96.299 |
| 445.0 | 96.188 |
| 444.0 | 96.348 |
| 443.0 | 97.845 |
| 442.0 | 97.777 |
| 441.0 | 96.465 |
| 440.0 | 96.371 |
| 439.0 | 96.066 |
| 438.0 | 96.96 |
| 437.0 | 97.913 |
| 436.0 | 96.953 |
| 435.0 | 95.369 |
| 434.0 | 95.465 |
| 433.0 | 95.516 |
| 432.0 | 95.41 |
| 431.0 | 96.395 |
| 430.0 | 96.358 |
| 429.0 | 94.479 |
| 428.0 | 94.864 |
| 427.0 | 94.427 |
| 426.0 | 94.931 |
| 425.0 | 95.137 |
| 424.0 | 94.906 |
| 423.0 | 94.697 |
| 422.0 | 94.405 |
| 421.0 | 94.19 |
| 420.0 | 94.03 |
| 419.0 | 93.867 |
| 418.0 | 93.641 |
| 417.0 | 93.255 |
| 416.0 | 92.786 |
| 415.0 | 92.32 |
| 414.0 | 91.86 |
| 413.0 | 91.364 |
| 412.0 | 90.763 |
| 411.0 | 90.096 |
| 410.0 | 89.511 |
| 409.0 | 88.896 |
| 408.0 | 88.079 |
| 407.0 | 87.081 |
| 406.0 | 85.798 |
| 405.0 | 83.429 |
| 404.0 | 74.316 |
| 403.0 | 53.028 |
| 402.0 | 26.541 |
| 401.0 | 8.347 |
| 400.0 | 1.52 |
| 399.0 | 0.172 |
| 398.0 | 0.02 |
| 397.0 | 0.003 |
| 396.0 | 0.004 |
| 395.0 | 0.006 |
| 394.0 | 0.003 |
| 393.0 | 0.003 |
| 392.0 | 0.006 |
| 391.0 | 0.002 |
| 390.0 | 0.004 |
| 389.0 | 0.002 |
| 388.0 | 0.001 |
| 387.0 | 0.004 |
| 386.0 | 0.005 |
| 385.0 | 0.003 |
| 384.0 | 0.005 |
| 383.0 | 0.001 |
| 382.0 | 0.001 |
| 381.0 | 0.004 |
| 380.0 | 0.005 |
| 379.0 | 0.002 |
| 378.0 | 0.005 |
| 377.0 | 0.004 |
| 376.0 | 0.005 |
| 375.0 | 0.001 |
| 374.0 | 0.003 |
| 373.0 | 0 |
| 372.0 | 0 |
| 371.0 | 0.003 |
| 370.0 | 0.006 |
| 369.0 | 0.002 |
| 368.0 | 0.004 |
| 367.0 | 0.002 |
| 366.0 | 0.001 |
| 365.0 | 0.003 |
| 364.0 | 0.005 |
| 363.0 | 0.002 |
| 362.0 | 0.005 |
| 361.0 | 0.002 |
| 360.0 | 0.002 |
| 359.0 | 0.004 |
| 358.0 | 0.005 |
| 357.0 | 0.005 |
| 356.0 | 0.005 |
| 355.0 | 0.003 |
| 354.0 | 0.001 |
| 353.0 | 0.004 |
| 352.0 | 0.005 |
| 351.0 | 0.002 |
| 350.0 | 0.005 |
| 349.0 | 0.002 |
| 348.0 | 0 |
| 347.0 | 0.005 |
| 346.0 | 0.005 |
| 345.0 | 0.003 |
| 344.0 | 0.005 |
| 343.0 | 0.003 |
| 342.0 | 0.002 |
| 341.0 | 0.004 |
| 340.0 | 0.005 |
| 339.0 | 0.003 |
| 338.0 | 0.004 |
| 337.0 | 0.002 |
| 336.0 | 0.002 |
| 335.0 | 0.006 |
| 334.0 | 0.004 |
| 333.0 | 0.002 |
| 332.0 | 0.004 |
| 331.0 | 0.002 |
| 330.0 | 0.001 |
| 329.0 | 0.004 |
| 328.0 | 0.005 |
| 327.0 | 0.002 |
| 326.0 | 0.004 |
| 325.0 | 0.004 |
| 324.0 | 0.001 |
| 323.0 | 0.006 |
| 322.0 | 0.005 |
| 321.0 | 0.002 |
| 320.0 | 0.005 |
| 319.0 | 0.002 |
| 318.0 | 0.005 |
| 317.0 | 0.005 |
| 316.0 | 0.006 |
| 315.0 | 0.004 |
| 314.0 | 0.005 |
| 313.0 | 0.001 |
| 312.0 | 0 |
| 311.0 | 0.004 |
| 310.0 | 0.006 |
| 309.0 | 0.001 |
| 308.0 | 0.004 |
| 307.0 | 0 |
| 306.0 | 0.003 |
| 305.0 | 0.005 |
| 304.0 | 0.004 |
| 303.0 | 0.004 |
| 302.0 | 0.005 |
| 301.0 | 0 |
| 300.0 | 0.001 |
| 299.0 | 0.005 |
| 298.0 | 0.005 |
| 297.0 | 0.005 |
| 296.0 | 0.004 |
| 295.0 | 0.001 |
| 294.0 | 0.001 |
| 293.0 | 0.005 |
| 292.0 | 0.006 |
| 291.0 | 0.001 |
| 290.0 | 0.004 |
| 289.0 | 0.001 |
| 288.0 | 0 |
| 287.0 | 0.005 |
| 286.0 | 0.005 |
| 285.0 | 0.006 |
| 284.0 | 0.003 |
| 283.0 | 0.001 |
| 282.0 | 0.001 |
| 281.0 | 0.005 |
| 280.0 | 0.005 |
| 279.0 | 0.003 |
| 278.0 | 0.004 |
| 277.0 | 0.002 |
| 276.0 | 0.001 |
| 275.0 | 0.007 |
| 274.0 | 0.004 |
| 273.0 | 0.003 |
| 272.0 | 0.005 |
| 271.0 | 0.002 |
| 270.0 | 0.001 |
| 269.0 | 0.007 |
| 268.0 | 0.007 |
| 267.0 | 0.002 |
| 266.0 | 0.001 |
| 265.0 | 0.001 |
| 264.0 | 0.001 |
| 263.0 | 0.005 |
| 262.0 | 0.006 |
| 261.0 | 0.005 |
| 260.0 | 0.005 |
| 259.0 | 0.002 |
| 258.0 | 0.002 |
| 257.0 | 0.006 |
| 256.0 | 0.006 |
| 255.0 | 0.006 |
| 254.0 | 0.004 |
| 253.0 | 0 |
| 252.0 | 0.003 |
| 251.0 | 0.005 |
| 250.0 | 0.007 |
| 249.0 | 0.001 |
| 248.0 | 0.005 |
| 247.0 | 0.001 |
| 246.0 | 0.002 |
| 245.0 | 0.006 |
| 244.0 | 0.007 |
| 243.0 | 0.004 |
| 242.0 | 0.006 |
| 241.0 | 0.001 |
| 240.0 | 0.002 |
| 239.0 | 0.005 |
| 238.0 | 0.006 |
| 237.0 | 0.003 |
| 236.0 | 0.005 |
| 235.0 | 0.001 |
| 234.0 | 0.003 |
| 233.0 | 0.005 |
| 232.0 | 0.008 |
| 231.0 | 0.001 |
| 230.0 | 0.006 |
| 229.0 | 0 |
| 228.0 | 0.003 |
| 227.0 | 0.004 |
| 226.0 | 0.005 |
| 225.0 | 0.005 |
| 224.0 | 0.005 |
| 223.0 | 0.001 |
| 222.0 | 0.002 |
| 221.0 | 0.005 |
| 220.0 | 0.007 |
| 219.0 | 0.002 |
| 218.0 | 0.006 |
| 217.0 | 0.002 |
| 216.0 | 0.002 |
| 215.0 | 0.007 |
| 214.0 | 0.007 |
| 213.0 | 0.006 |
| 212.0 | 0.007 |
| 211.0 | 0.003 |
| 210.0 | 0.004 |
| 209.0 | 0.007 |
| 208.0 | 0.007 |
| 207.0 | 0.004 |
| 206.0 | 0.005 |
| 205.0 | 0.004 |
| 204.0 | 0.005 |
| 203.0 | 0.01 |
| 202.0 | 0.009 |
| 201.0 | 0.01 |
| 200.0 | 0.011 |